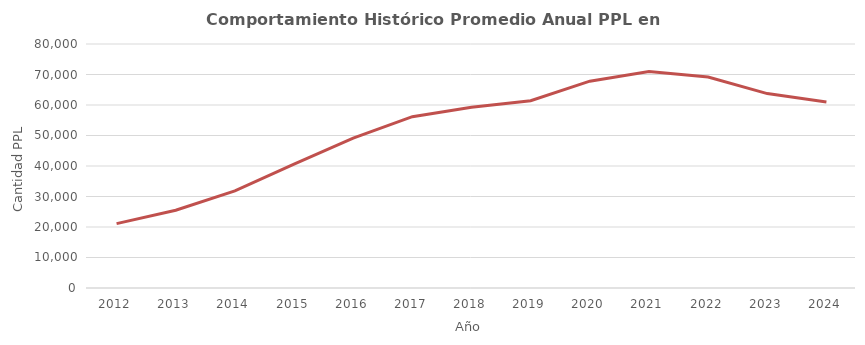
| Category | Promedio anual Domiciliaria |
|---|---|
| 2012.0 | 21098.25 |
| 2013.0 | 25499.083 |
| 2014.0 | 31836.75 |
| 2015.0 | 40614.5 |
| 2016.0 | 49161.167 |
| 2017.0 | 56180.75 |
| 2018.0 | 59289.25 |
| 2019.0 | 61380.5 |
| 2020.0 | 67811 |
| 2021.0 | 70980.5 |
| 2022.0 | 69173.833 |
| 2023.0 | 63744.25 |
| 2024.0 | 61007 |